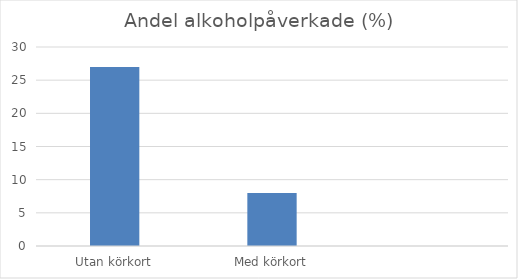
| Category | Andel % |
|---|---|
| Utan körkort | 27 |
| Med körkort | 8 |